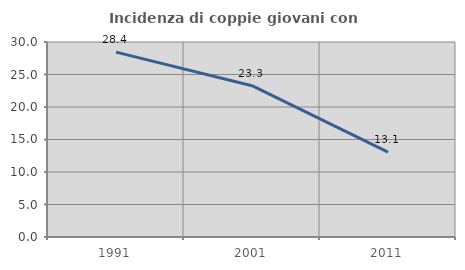
| Category | Incidenza di coppie giovani con figli |
|---|---|
| 1991.0 | 28.444 |
| 2001.0 | 23.274 |
| 2011.0 | 13.066 |